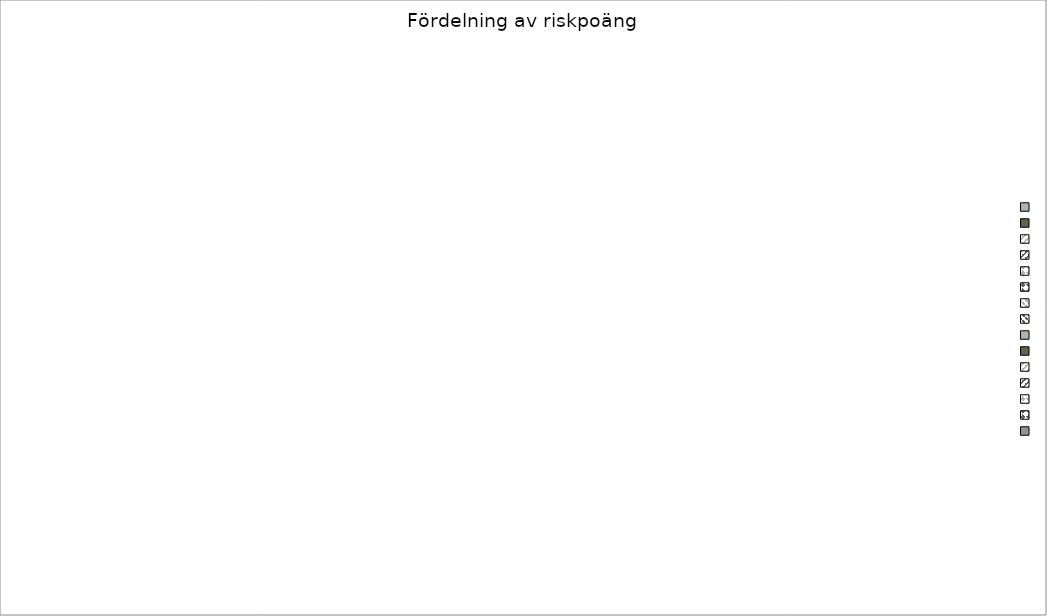
| Category | Series 1 |
|---|---|
| 0 | 0 |
| 1 | 0 |
| 2 | 0 |
| 3 | 0 |
| 4 | 0 |
| 5 | 0 |
| 6 | 0 |
| 7 | 0 |
| 8 | 0 |
| 9 | 0 |
| 10 | 0 |
| 11 | 0 |
| 12 | 0 |
| 13 | 0 |
| 14 | 0 |